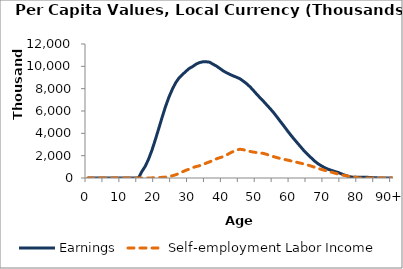
| Category | Earnings | Self-employment Labor Income |
|---|---|---|
| 0 | 0 | 0 |
|  | 0 | 0 |
| 2 | 0 | 0 |
| 3 | 0 | 0 |
| 4 | 0 | 0 |
| 5 | 0 | 0 |
| 6 | 0 | 0 |
| 7 | 0 | 0 |
| 8 | 0 | 0 |
| 9 | 0 | 0 |
| 10 | 0 | 0 |
| 11 | 0 | 0 |
| 12 | 0 | 0 |
| 13 | 0 | 0 |
| 14 | 0 | 0 |
| 15 | 0 | 0 |
| 16 | 578586.737 | 0 |
| 17 | 1043153.854 | 0 |
| 18 | 1698594.966 | 0 |
| 19 | 2502764.275 | 12149.455 |
| 20 | 3444169.883 | 23391.217 |
| 21 | 4435901.924 | 39402.983 |
| 22 | 5443244.978 | 57801.597 |
| 23 | 6402530.202 | 79641.51 |
| 24 | 7240974.441 | 129213.738 |
| 25 | 7944007.273 | 201019.746 |
| 26 | 8532737.488 | 288232.003 |
| 27 | 8964996.947 | 406158.101 |
| 28 | 9264730.866 | 552659.251 |
| 29 | 9545410.302 | 686383.542 |
| 30 | 9811600.134 | 798871.777 |
| 31 | 9979658.335 | 925142.398 |
| 32 | 10191245.135 | 1022415.307 |
| 33 | 10332896.974 | 1097494.235 |
| 34 | 10404315.974 | 1203006.529 |
| 35 | 10410921.662 | 1329686.356 |
| 36 | 10371080.982 | 1443929.026 |
| 37 | 10196070.155 | 1566920.768 |
| 38 | 10028796.726 | 1711177.634 |
| 39 | 9822384.428 | 1814348.411 |
| 40 | 9600649.193 | 1908833.912 |
| 41 | 9427308.897 | 2057518.465 |
| 42 | 9279435.108 | 2228557.01 |
| 43 | 9140452.265 | 2375923.253 |
| 44 | 9023686.754 | 2503959.367 |
| 45 | 8882855.289 | 2576479.216 |
| 46 | 8669675.386 | 2532957.035 |
| 47 | 8433958.118 | 2451509.591 |
| 48 | 8154267.452 | 2381234.324 |
| 49 | 7827366.522 | 2319775.926 |
| 50 | 7484024.213 | 2276545.817 |
| 51 | 7161119.594 | 2245659.165 |
| 52 | 6846278.455 | 2196171.287 |
| 53 | 6512299.939 | 2105242.586 |
| 54 | 6182644.552 | 2001698.326 |
| 55 | 5827364.663 | 1906726.547 |
| 56 | 5434549.952 | 1820844.224 |
| 57 | 5034573.221 | 1737280.673 |
| 58 | 4642167.396 | 1671225.303 |
| 59 | 4236717.051 | 1606325.58 |
| 60 | 3846946.997 | 1534930.894 |
| 61 | 3475155.156 | 1465528.028 |
| 62 | 3119207.559 | 1392663.935 |
| 63 | 2764838.502 | 1319291.692 |
| 64 | 2409595.467 | 1242716.102 |
| 65 | 2101309.691 | 1164485.942 |
| 66 | 1817722.488 | 1066439.733 |
| 67 | 1527785.995 | 970775.984 |
| 68 | 1289182.879 | 870113.915 |
| 69 | 1098840.761 | 773567.318 |
| 70 | 927086.033 | 685070.233 |
| 71 | 789815.806 | 606363.485 |
| 72 | 688954.742 | 522024.389 |
| 73 | 581103.95 | 436053.715 |
| 74 | 497297.211 | 358523.871 |
| 75 | 367298.98 | 283897.095 |
| 76 | 250027.53 | 218144.343 |
| 77 | 150539.948 | 166758.491 |
| 78 | 84134.686 | 133613.691 |
| 79 | 56450.626 | 94585.51 |
| 80 | 65045.684 | 0 |
| 81 | 77771.174 | 0 |
| 82 | 72521.484 | 0 |
| 83 | 55215.659 | 0 |
| 84 | 37184.23 | 0 |
| 85 | 18215.159 | 0 |
| 86 | 4314.247 | 0 |
| 87 | 0 | 0 |
| 88 | 0 | 0 |
| 89 | 0 | 0 |
| 90+ | 0 | 0 |